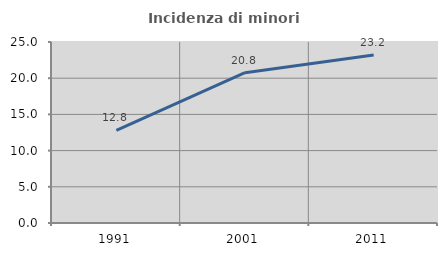
| Category | Incidenza di minori stranieri |
|---|---|
| 1991.0 | 12.804 |
| 2001.0 | 20.763 |
| 2011.0 | 23.211 |